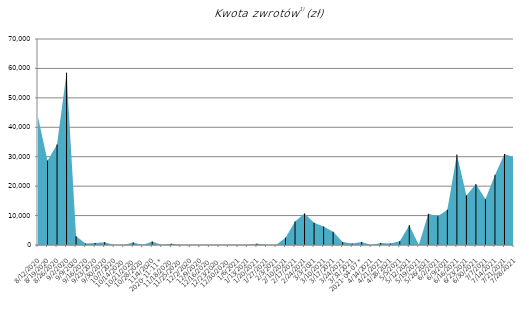
| Category | Kwota zwrotów 1) (zł) |
|---|---|
| 2020-08-12 | 43379.47 |
| 2020-08-19 | 28665 |
| 2020-08-26 | 34177 |
| 2020-09-02 | 58565 |
| 2020-09-09 | 3000 |
| 2020-09-16 | 500 |
| 2020-09-23 | 687 |
| 2020-09-30 | 940 |
| 2020-10-07 | 0 |
| 2020-10-14 | 0 |
| 2020-10-21 | 879 |
| 2020-10-28 | 0 |
| 2020-11-04 | 1200 |
|    2020-11-11 * | 0 |
| 2020-11-18 | 450 |
| 2020-11-25 | 0 |
| 2020-12-02 | 0 |
| 2020-12-09 | 0 |
| 2020-12-16 | 0 |
| 2020-12-23 | 0 |
| 2020-12-30 | 0 |
| 2021-01-06 | 0 |
| 2021-01-13 | 0 |
| 2021-01-20 | 461.4 |
| 2021-01-27 | 0 |
| 2021-02-03 | 0 |
| 2021-02-10 | 2500 |
| 2021-02-17 | 8000 |
| 2021-02-24 | 10710 |
| 2021-03-03 | 7600 |
| 2021-03-10 | 6250 |
| 2021-03-17 | 4500 |
| 2021-03-24 | 1000 |
| 2021-03-31 | 500 |
|    2021-04-07 * | 1000 |
| 2021-04-14 | 0 |
| 2021-04-21 | 700 |
| 2021-04-28 | 500 |
| 2021-05-05 | 1287 |
| 2021-05-12 | 6750 |
| 2021-05-19 | 0 |
| 2021-05-26 | 10600 |
| 2021-06-02 | 9800 |
| 2021-06-09 | 12000 |
| 2021-06-16 | 30765 |
| 2021-06-23 | 16860 |
| 2021-06-30 | 20688.8 |
| 2021-07-07 | 15528 |
| 2021-07-14 | 23816 |
| 2021-07-21 | 30913 |
| 2021-07-28 | 29799 |